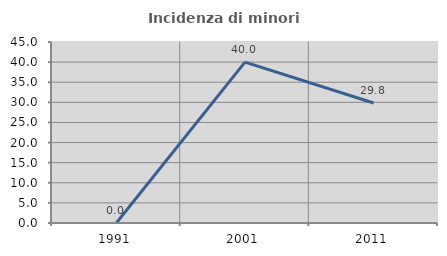
| Category | Incidenza di minori stranieri |
|---|---|
| 1991.0 | 0 |
| 2001.0 | 40 |
| 2011.0 | 29.825 |